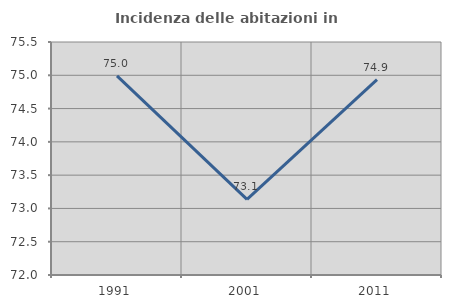
| Category | Incidenza delle abitazioni in proprietà  |
|---|---|
| 1991.0 | 74.99 |
| 2001.0 | 73.137 |
| 2011.0 | 74.934 |